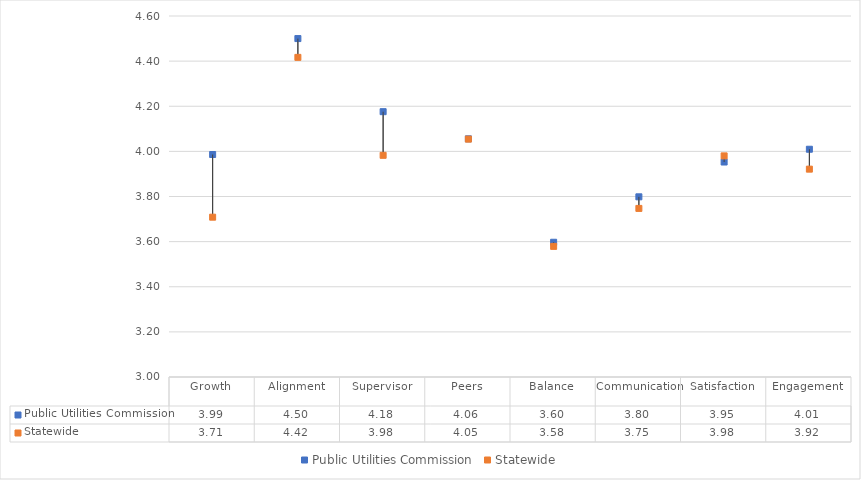
| Category | Public Utilities Commission | Statewide |
|---|---|---|
| Growth | 3.986 | 3.708 |
| Alignment | 4.5 | 4.417 |
| Supervisor | 4.176 | 3.983 |
| Peers | 4.056 | 4.054 |
| Balance | 3.597 | 3.579 |
| Communication | 3.799 | 3.747 |
| Satisfaction | 3.953 | 3.98 |
| Engagement | 4.009 | 3.921 |